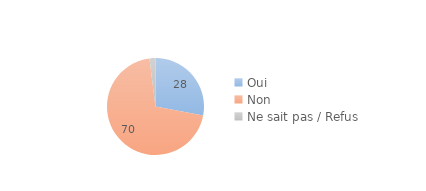
| Category | Series 0 |
|---|---|
| Oui | 28 |
| Non | 70 |
| Ne sait pas / Refus | 2 |